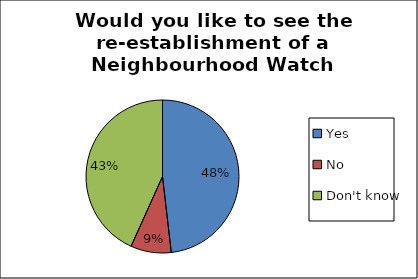
| Category | Series 0 |
|---|---|
| Yes | 0.482 |
| No | 0.086 |
| Don't know | 0.433 |